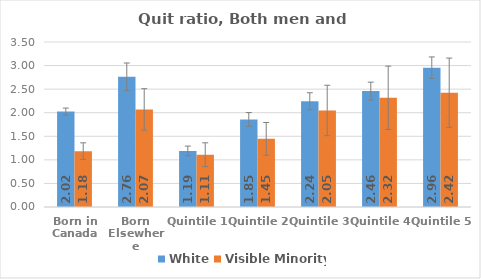
| Category | White | Visible Minority |
|---|---|---|
| Born in Canada | 2.024 | 1.185 |
| Born Elsewhere | 2.762 | 2.07 |
| Quintile 1 | 1.189 | 1.109 |
| Quintile 2 | 1.854 | 1.445 |
| Quintile 3 | 2.242 | 2.048 |
| Quintile 4 | 2.458 | 2.316 |
| Quintile 5 | 2.955 | 2.425 |